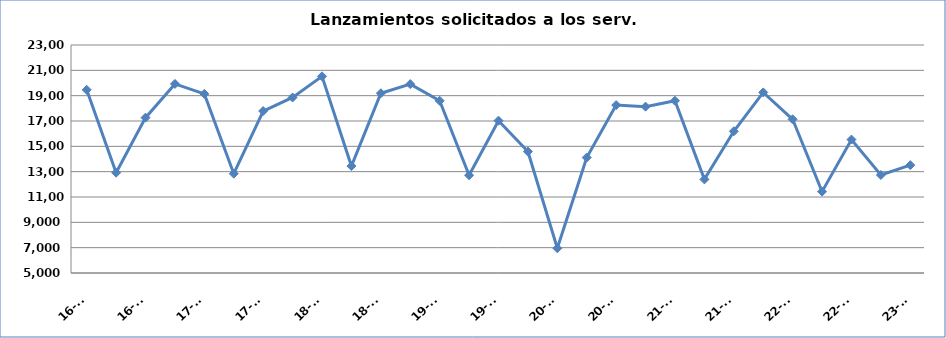
| Category | Series 0 |
|---|---|
| 16-T2 | 19461 |
| 16-T3 | 12918 |
| 16-T4 | 17265 |
| 17-T1 | 19926 |
| 17-T2 | 19141 |
| 17-T3 | 12840 |
| 17-T4 | 17786 |
| 18-T1 | 18859 |
| 18-T2 | 20526 |
| 18-T3 | 13446 |
| 18-T4 | 19192 |
| 19-T1 | 19913 |
| 19-T2 | 18594 |
| 19-T3 | 12715 |
| 19-T4 | 17025 |
| 20-T1 | 14586 |
| 20-T2 | 6953 |
| 20-T3 | 14117 |
| 20-T4 | 18255 |
| 21-T1 | 18131 |
| 21-T2 | 18598 |
| 21-T3 | 12390 |
| 21-T4 | 16187 |
| 22-T1 | 19257 |
| 22-T2 | 17134 |
| 22-T3 | 11425 |
| 22-T4 | 15536 |
| 23-T1 | 12736 |
| 23-T2 | 13516 |